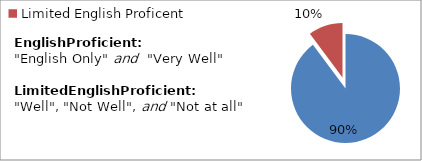
| Category | Percent |
|---|---|
| English Proficient | 0.898 |
| Limited English Proficent | 0.102 |